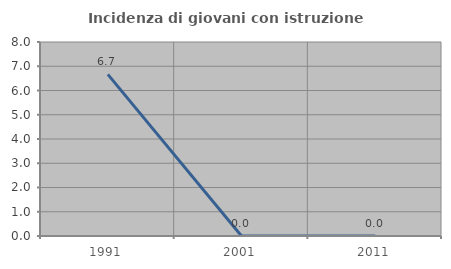
| Category | Incidenza di giovani con istruzione universitaria |
|---|---|
| 1991.0 | 6.667 |
| 2001.0 | 0 |
| 2011.0 | 0 |